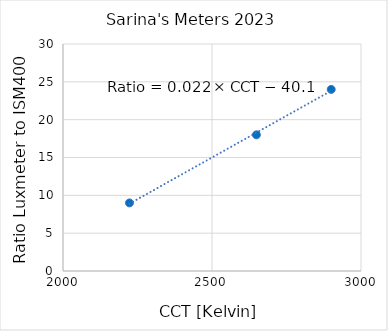
| Category | Series 0 |
|---|---|
| 2223.0 | 9 |
| 2649.0 | 18 |
| 2900.0 | 24 |